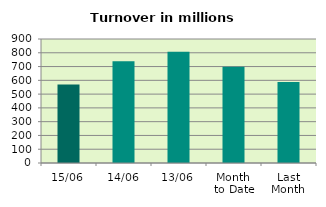
| Category | Series 0 |
|---|---|
| 15/06 | 569.442 |
| 14/06 | 739.176 |
| 13/06 | 806.831 |
| Month 
to Date | 698.474 |
| Last
Month | 587.249 |